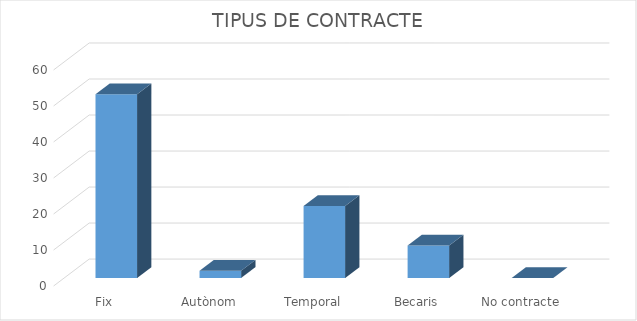
| Category | Series 0 |
|---|---|
| Fix | 51 |
| Autònom | 2 |
| Temporal | 20 |
| Becaris | 9 |
| No contracte | 0 |